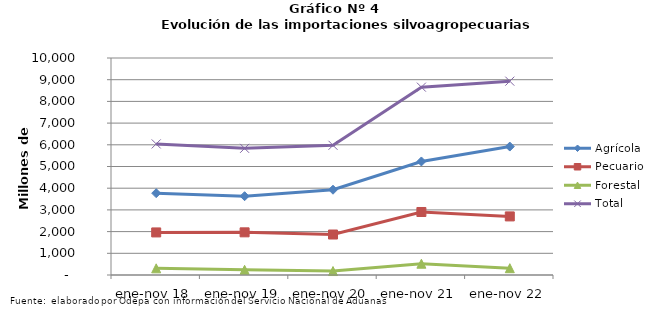
| Category | Agrícola | Pecuario | Forestal | Total |
|---|---|---|---|---|
| ene-nov 18 | 3770604 | 1961774 | 307528 | 6039906 |
| ene-nov 19 | 3631832 | 1965902 | 239178 | 5836912 |
| ene-nov 20 | 3929417 | 1865252 | 182836 | 5977505 |
| ene-nov 21 | 5232393 | 2903875 | 520281 | 8656549 |
| ene-nov 22 | 5919126 | 2699710 | 313746 | 8932582 |